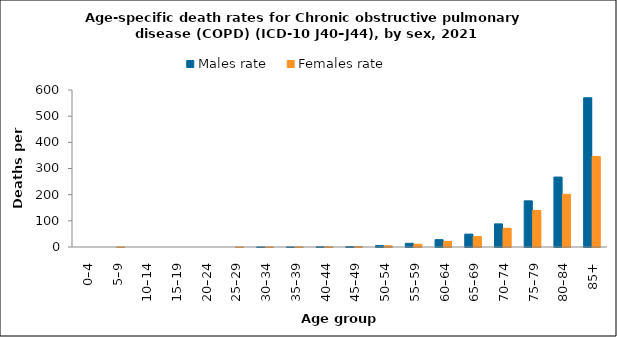
| Category | Males rate | Females rate |
|---|---|---|
| 0–4 | 0 | 0 |
| 5–9 | 0 | 0.127 |
| 10–14 | 0 | 0 |
| 15–19 | 0 | 0 |
| 20–24 | 0 | 0 |
| 25–29 | 0 | 0.111 |
| 30–34 | 0.213 | 0.104 |
| 35–39 | 0.215 | 0.319 |
| 40–44 | 0.858 | 0.835 |
| 45–49 | 1.835 | 1.561 |
| 50–54 | 5.415 | 4.527 |
| 55–59 | 14.163 | 10.66 |
| 60–64 | 27.981 | 21.623 |
| 65–69 | 49.228 | 39.692 |
| 70–74 | 88.337 | 71.95 |
| 75–79 | 176.36 | 139.501 |
| 80–84 | 267.241 | 201.39 |
| 85+ | 570.356 | 345.99 |